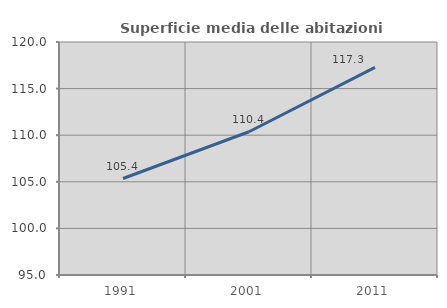
| Category | Superficie media delle abitazioni occupate |
|---|---|
| 1991.0 | 105.353 |
| 2001.0 | 110.369 |
| 2011.0 | 117.275 |